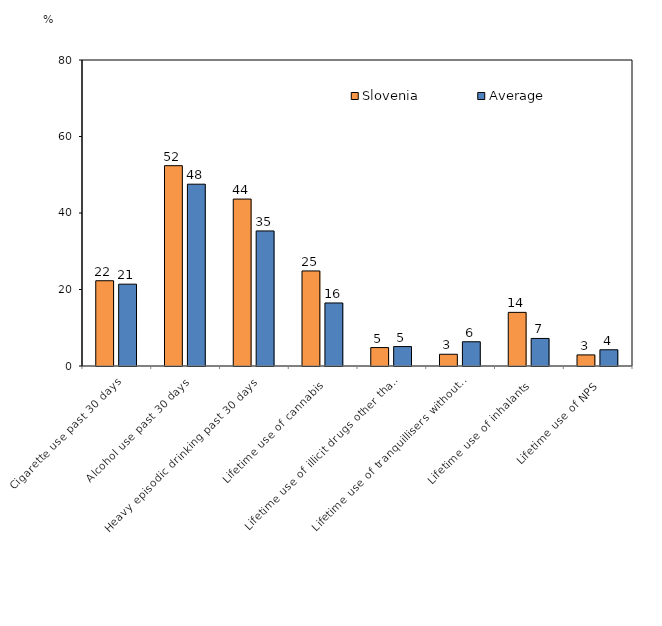
| Category | Slovenia | Average |
|---|---|---|
| Cigarette use past 30 days | 22.29 | 21.397 |
| Alcohol use past 30 days | 52.37 | 47.531 |
| Heavy episodic drinking past 30 days | 43.64 | 35.309 |
| Lifetime use of cannabis | 24.85 | 16.48 |
| Lifetime use of illicit drugs other than cannabis | 4.82 | 5.079 |
| Lifetime use of tranquillisers without prescription  | 3.07 | 6.34 |
| Lifetime use of inhalants | 14.02 | 7.202 |
| Lifetime use of NPS | 2.9 | 4.246 |